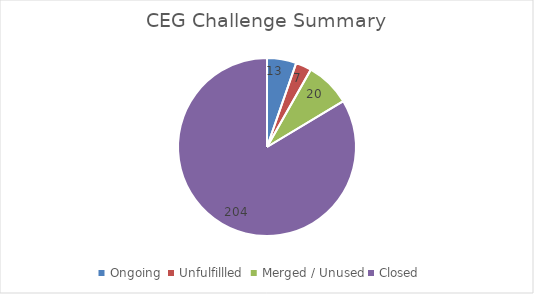
| Category | Series 0 |
|---|---|
| Ongoing  | 13 |
| Unfulfillled  | 7 |
| Merged / Unused | 20 |
| Closed  | 204 |